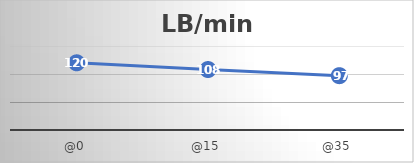
| Category | LB/min |
|---|---|
| @0 | 120 |
| @15 | 108 |
| @35 | 97 |